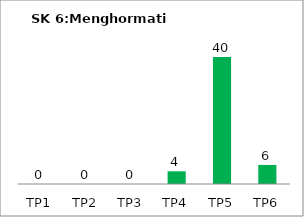
| Category | Bil Pel |
|---|---|
| TP1 | 0 |
| TP2 | 0 |
| TP3 | 0 |
| TP4 | 4 |
| TP5 | 40 |
| TP6 | 6 |